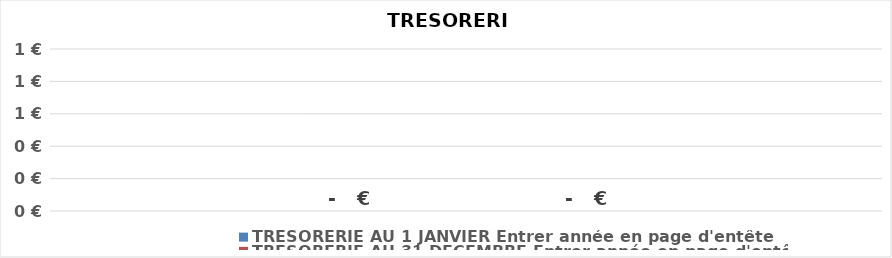
| Category | TRESORERIE AU 1 JANVIER Entrer année en page d'entête | TRESORERIE AU 31 DECEMBRE Entrer année en page d'entête |
|---|---|---|
| 0 | 0 | 0 |